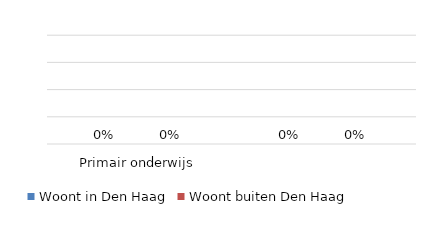
| Category | Woont in Den Haag | Woont buiten Den Haag |
|---|---|---|
| Primair onderwijs | 0.581 | 0.419 |
| Voortgezet onderwijs | 0.518 | 0.482 |